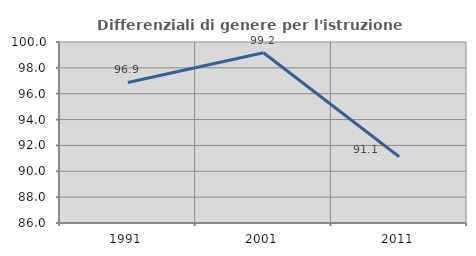
| Category | Differenziali di genere per l'istruzione superiore |
|---|---|
| 1991.0 | 96.868 |
| 2001.0 | 99.169 |
| 2011.0 | 91.128 |